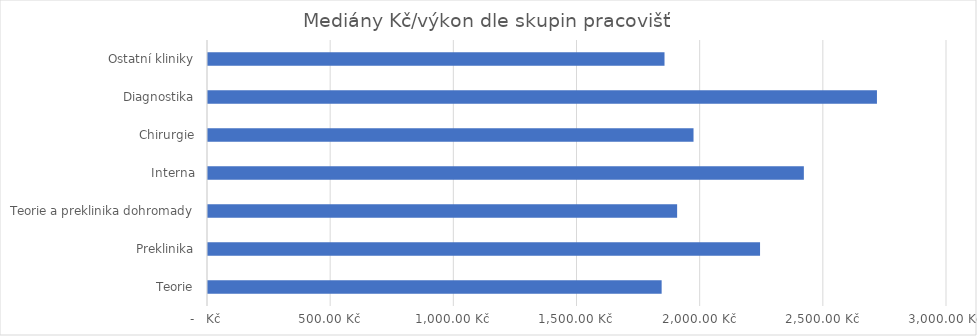
| Category | Series 0 |
|---|---|
| Teorie | 1841.604 |
| Preklinika | 2241.05 |
| Teorie a preklinika dohromady | 1904.429 |
| Interna | 2418.884 |
| Chirurgie | 1970.996 |
| Diagnostika | 2715.639 |
| Ostatní kliniky | 1853.231 |